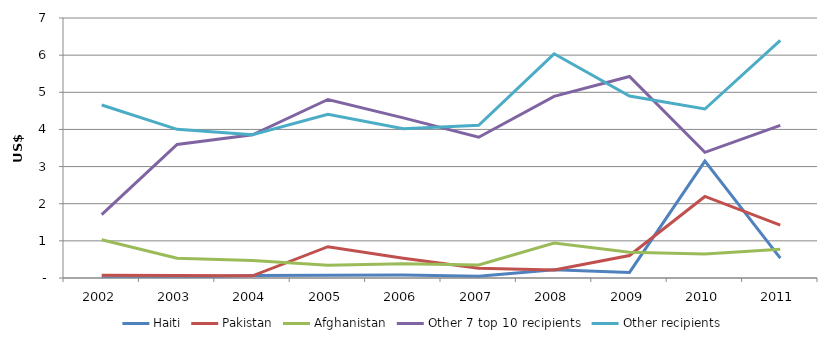
| Category | Haiti | Pakistan | Afghanistan | Other 7 top 10 recipients | Other recipients |
|---|---|---|---|---|---|
| 2002.0 | 0.006 | 0.072 | 1.029 | 1.708 | 4.657 |
| 2003.0 | 0.014 | 0.071 | 0.535 | 3.594 | 4.002 |
| 2004.0 | 0.071 | 0.059 | 0.472 | 3.855 | 3.86 |
| 2005.0 | 0.077 | 0.842 | 0.345 | 4.806 | 4.41 |
| 2006.0 | 0.081 | 0.531 | 0.384 | 4.312 | 4.017 |
| 2007.0 | 0.049 | 0.265 | 0.352 | 3.79 | 4.111 |
| 2008.0 | 0.224 | 0.216 | 0.943 | 4.891 | 6.036 |
| 2009.0 | 0.151 | 0.606 | 0.691 | 5.426 | 4.9 |
| 2010.0 | 3.145 | 2.195 | 0.645 | 3.382 | 4.55 |
| 2011.0 | 0.533 | 1.426 | 0.771 | 4.109 | 6.4 |